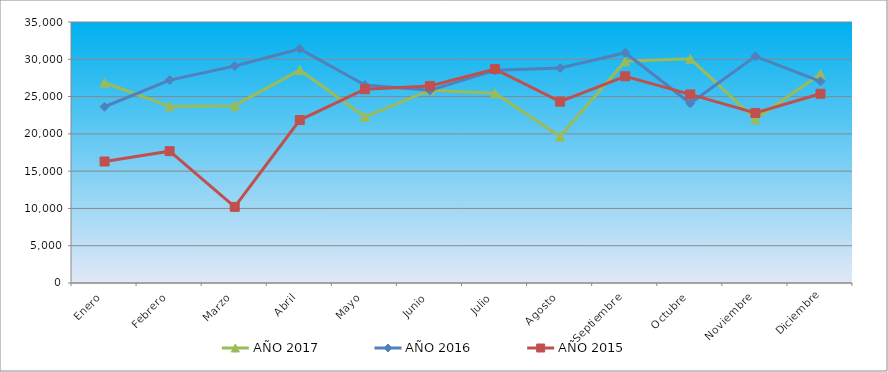
| Category | AÑO 2017 | AÑO 2016 | AÑO 2015 |
|---|---|---|---|
| Enero | 26857.399 | 23635.033 | 16293.006 |
| Febrero | 23686.533 | 27209.266 | 17680.941 |
| Marzo | 23784.462 | 29096.985 | 10210.34 |
| Abril | 28559.518 | 31387.408 | 21853.449 |
| Mayo | 22282.755 | 26554.479 | 25980.553 |
| Junio | 25858.434 | 25836.593 | 26425.623 |
| Julio | 25437.798 | 28514.431 | 28691.876 |
| Agosto | 19631.777 | 28838.293 | 24318.416 |
| Septiembre | 29732.301 | 30877.086 | 27719.842 |
| Octubre | 30059.762 | 24097.83 | 25289.703 |
| Noviembre | 21968.387 | 30392.103 | 22801.22 |
| Diciembre | 28034.361 | 27036.909 | 25375.003 |